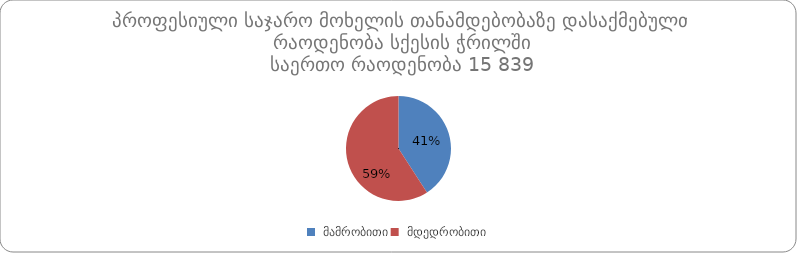
| Category | რაოდენობა |
|---|---|
|  მამრობითი | 6474 |
|  მდედრობითი | 9365 |